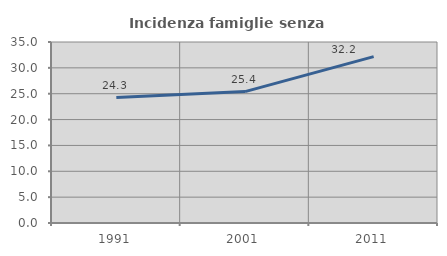
| Category | Incidenza famiglie senza nuclei |
|---|---|
| 1991.0 | 24.264 |
| 2001.0 | 25.405 |
| 2011.0 | 32.177 |